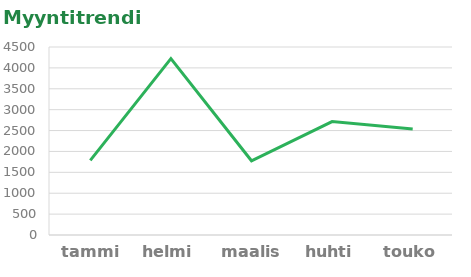
| Category | Sandaalit |
|---|---|
| tammi | 1787 |
| helmi | 4222 |
| maalis | 1777 |
| huhti | 2715 |
| touko | 2539 |